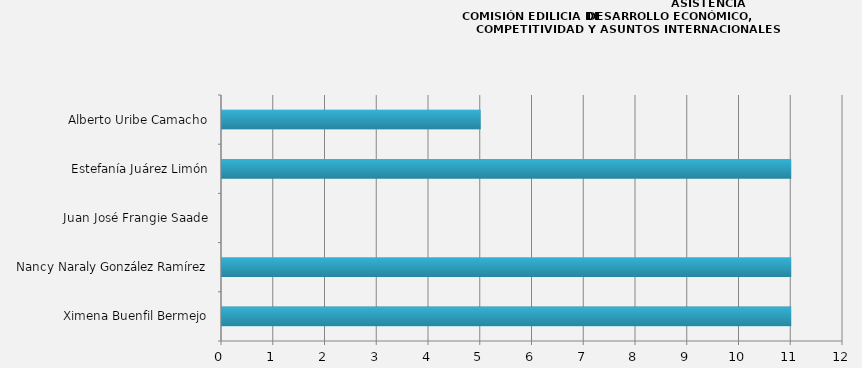
| Category | Series 0 |
|---|---|
| Ximena Buenfil Bermejo | 11 |
| Nancy Naraly González Ramírez | 11 |
| Juan José Frangie Saade | 0 |
| Estefanía Juárez Limón | 11 |
| Alberto Uribe Camacho | 5 |